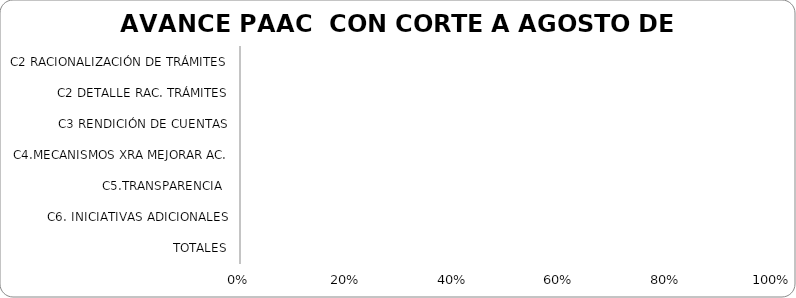
| Category | Series 0 |
|---|---|
| C2 RACIONALIZACIÓN DE TRÁMITES | 0 |
| C2 DETALLE RAC. TRÁMITES | 0 |
| C3 RENDICIÓN DE CUENTAS | 0 |
| C4.MECANISMOS XRA MEJORAR AC. | 0 |
| C5.TRANSPARENCIA  | 0 |
| C6. INICIATIVAS ADICIONALES | 0 |
| TOTALES | 0 |